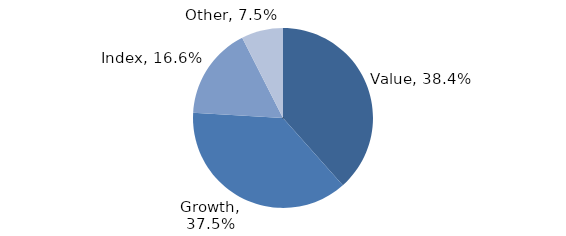
| Category | Investment Style |
|---|---|
| Value | 0.384 |
| Growth | 0.375 |
| Index | 0.166 |
| Other | 0.075 |